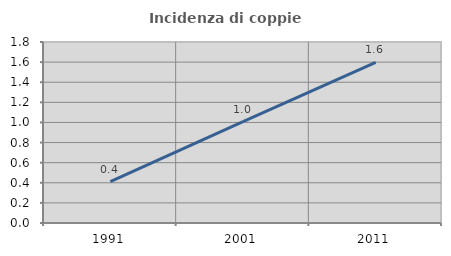
| Category | Incidenza di coppie miste |
|---|---|
| 1991.0 | 0.411 |
| 2001.0 | 1.007 |
| 2011.0 | 1.596 |